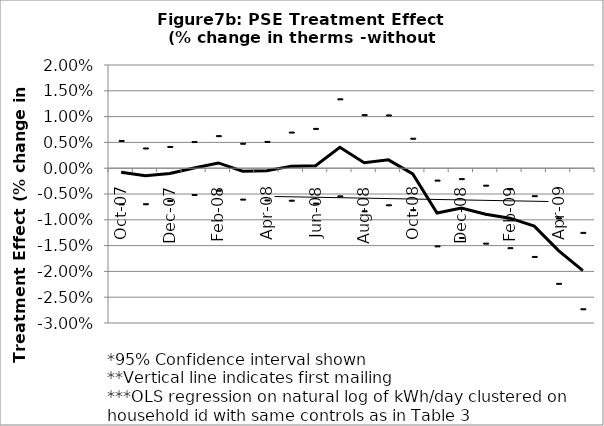
| Category | Treatment | 2 SD below | 2 SD above |
|---|---|---|---|
| 2007-10-01 | -0.001 | -0.007 | 0.005 |
| 2007-11-01 | -0.001 | -0.007 | 0.004 |
| 2007-12-01 | -0.001 | -0.006 | 0.004 |
| 2008-01-01 | 0 | -0.005 | 0.005 |
| 2008-02-01 | 0.001 | -0.004 | 0.006 |
| 2008-03-01 | -0.001 | -0.006 | 0.005 |
| 2008-04-01 | 0 | -0.006 | 0.005 |
| 2008-05-01 | 0 | -0.006 | 0.007 |
| 2008-06-01 | 0 | -0.007 | 0.008 |
| 2008-07-01 | 0.004 | -0.005 | 0.013 |
| 2008-08-01 | 0.001 | -0.008 | 0.01 |
| 2008-09-01 | 0.002 | -0.007 | 0.01 |
| 2008-10-01 | -0.001 | -0.008 | 0.006 |
| 2008-11-01 | -0.009 | -0.015 | -0.002 |
| 2008-12-01 | -0.008 | -0.013 | -0.002 |
| 2009-01-01 | -0.009 | -0.015 | -0.003 |
| 2009-02-01 | -0.01 | -0.015 | -0.004 |
| 2009-03-01 | -0.011 | -0.017 | -0.005 |
| 2009-04-01 | -0.016 | -0.022 | -0.01 |
| 2009-05-01 | -0.02 | -0.027 | -0.012 |